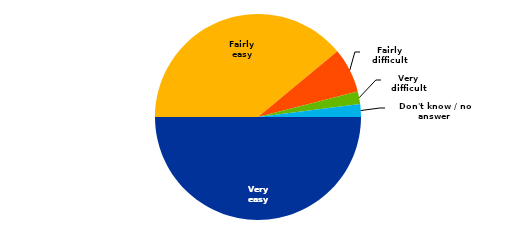
| Category | EA |
|---|---|
| Very easy | 0.5 |
| Fairly easy | 0.39 |
| Fairly difficult | 0.07 |
| Very difficult | 0.02 |
| Don't know / no answer | 0.02 |